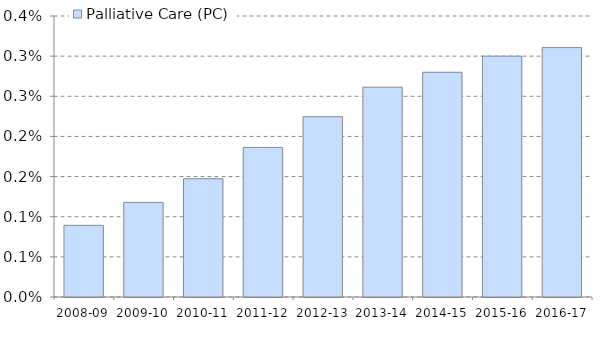
| Category | Palliative Care (PC) |
|---|---|
| 2008-09 | 0.001 |
| 2009-10 | 0.001 |
| 2010-11 | 0.001 |
| 2011-12 | 0.002 |
| 2012-13 | 0.002 |
| 2013-14 | 0.003 |
| 2014-15 | 0.003 |
| 2015-16 | 0.003 |
| 2016-17 | 0.003 |